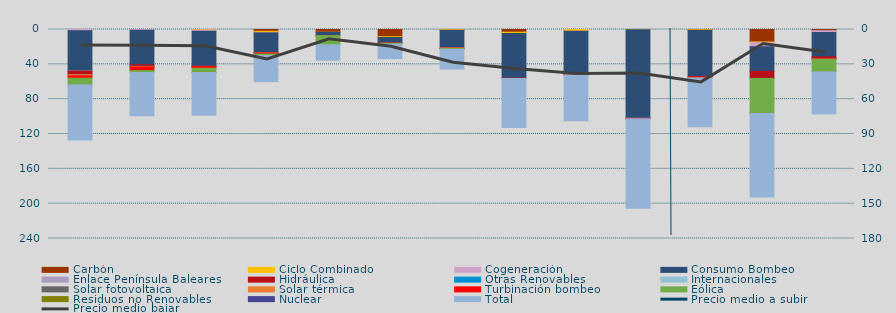
| Category | Carbón | Ciclo Combinado | Cogeneración | Consumo Bombeo | Enlace Península Baleares | Hidráulica | Otras Renovables | Internacionales | Solar fotovoltaica | Solar térmica | Turbinación bombeo | Eólica | Residuos no Renovables | Nuclear | Total |
|---|---|---|---|---|---|---|---|---|---|---|---|---|---|---|---|
| 0 | 0 | 0 | 1422.6 | 46116.4 | 244.8 | 3856.5 | 133 |  | 261 | 1246 | 2583.9 | 7321.7 | 241.6 |  | 63427.5 |
| 1 | 0 | 40 | 929.7 | 39454.4 | 0 | 1791.1 | 107.5 |  | 141 | 584.1 | 4128.8 | 2184.2 | 112.3 |  | 49473.1 |
| 2 | 0 | 570.5 | 1413.2 | 39702.4 | 0 | 426.9 | 339.1 |  | 9.1 | 19.1 | 1985.9 | 4712.9 | 87.1 |  | 49266.2 |
| 3 | 2132.8 | 1653.1 | 89.7 | 22758.3 | 0 | 206.1 | 0 |  | 8.2 | 112.5 | 1136.7 | 1839.6 | 0 |  | 29937 |
| 4 | 3265.4 | 16.7 | 18.4 | 3709.8 | 0 | 1.6 | 0 |  | 0 | 0 | 36.6 | 10611 | 0 |  | 17659.5 |
| 5 | 8244.2 | 904.8 | 2.7 | 6336.3 | 0 | 40 | 0 |  | 0 | 0 | 211.7 | 978.8 | 0 |  | 16718.5 |
| 6 | 208.4 | 783.8 | 39.5 | 20030 | 213.5 | 0 | 0 |  | 0 | 34.2 | 399.9 | 1049.8 | 0 |  | 22759.1 |
| 7 | 3100.2 | 1575.6 | 0 | 51191.5 | 0 | 0 | 0 |  | 0 | 0 | 347.6 | 12.5 | 0 |  | 56227.4 |
| 8 | 0 | 1898.2 | 24.2 | 49736.3 | 0 | 0 | 0 |  | 0.1 | 0 | 619.4 | 105.1 | 0 |  | 52383.3 |
| 9 | 0 | 331 | 0 | 101506.1 | 204 | 106.7 | 0 |  | 0 | 0 | 462.2 | 0 | 0 |  | 102610 |
| 10 | 376.2 | 910.9 | 0 | 52921.9 | 0 | 0 | 0 |  | 0 | 0 | 1542.2 | 42.8 | 0 |  | 55794 |
| 11 | 14289.6 | 859.1 | 4696.2 | 28184.1 | 0 | 7974.2 | 28.6 |  | 0 | 0 | 110.8 | 39780.1 | 224.9 |  | 96147.6 |
| 12 | 1420.9 | 0 | 2021.5 | 27920 | 0 | 2396.1 | 21.7 |  | 0 | 224.2 | 474.7 | 13875.8 | 98.3 |  | 48453.2 |